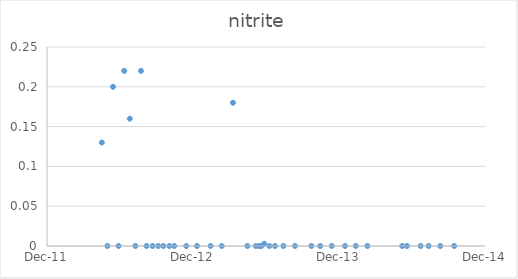
| Category | Series 0 |
|---|---|
| 41017.0 | 0.13 |
| 41031.0 | 0 |
| 41045.0 | 0.2 |
| 41059.0 | 0 |
| 41073.0 | 0.22 |
| 41087.0 | 0.16 |
| 41101.0 | 0 |
| 41115.0 | 0.22 |
| 41129.0 | 0 |
| 41144.0 | 0 |
| 41158.0 | 0 |
| 41171.0 | 0 |
| 41186.0 | 0 |
| 41198.0 | 0 |
| 41228.0 | 0 |
| 41255.0 | 0 |
| 41289.0 | 0 |
| 41317.0 | 0 |
| 41345.0 | 0.18 |
| 41381.0 | 0 |
| 41402.0 | 0 |
| 41410.0 | 0 |
| 41416.0 | 0 |
| 41423.0 | 0.003 |
| 41436.0 | 0 |
| 41450.0 | 0 |
| 41471.0 | 0 |
| 41500.0 | 0 |
| 41541.0 | 0 |
| 41563.0 | 0 |
| 41592.0 | 0 |
| 41625.0 | 0 |
| 41652.0 | 0 |
| 41681.0 | 0 |
| 41768.0 | 0 |
| 41780.0 | 0 |
| 41814.0 | 0 |
| 41834.0 | 0 |
| 41863.0 | 0 |
| 41898.0 | 0 |